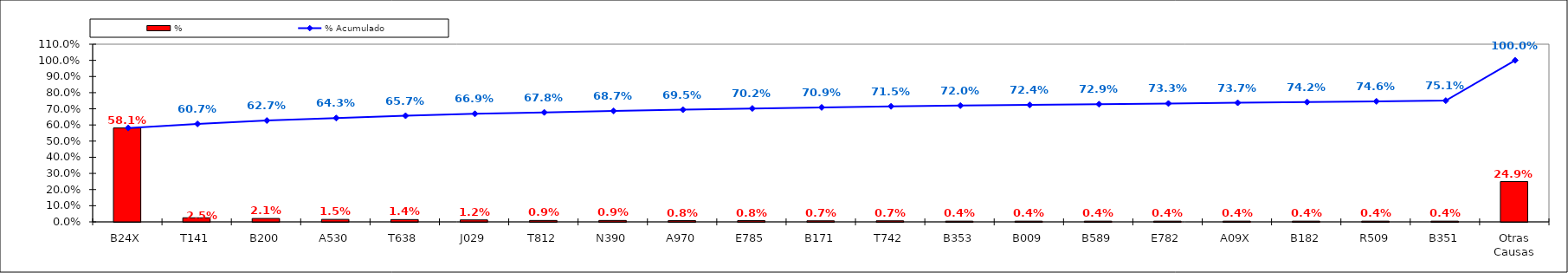
| Category | % |
|---|---|
| B24X | 0.581 |
| T141 | 0.025 |
| B200 | 0.021 |
| A530 | 0.015 |
| T638 | 0.014 |
| J029 | 0.012 |
| T812 | 0.009 |
| N390 | 0.009 |
| A970 | 0.008 |
| E785 | 0.008 |
| B171 | 0.007 |
| T742 | 0.007 |
| B353 | 0.004 |
| B009 | 0.004 |
| B589 | 0.004 |
| E782 | 0.004 |
| A09X | 0.004 |
| B182 | 0.004 |
| R509 | 0.004 |
| B351 | 0.004 |
| Otras Causas | 0.249 |